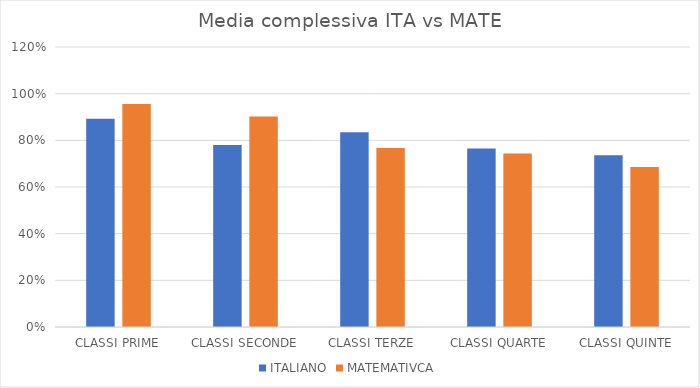
| Category | ITALIANO | MATEMATIVCA |
|---|---|---|
| CLASSI PRIME | 0.892 | 0.956 |
| CLASSI SECONDE | 0.78 | 0.902 |
| CLASSI TERZE | 0.834 | 0.768 |
| CLASSI QUARTE | 0.765 | 0.744 |
| CLASSI QUINTE | 0.736 | 0.686 |